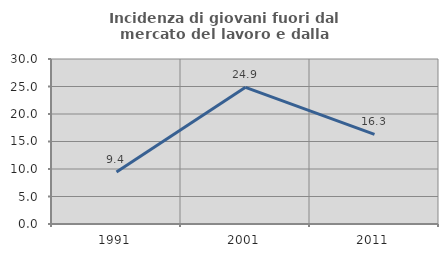
| Category | Incidenza di giovani fuori dal mercato del lavoro e dalla formazione  |
|---|---|
| 1991.0 | 9.434 |
| 2001.0 | 24.852 |
| 2011.0 | 16.279 |